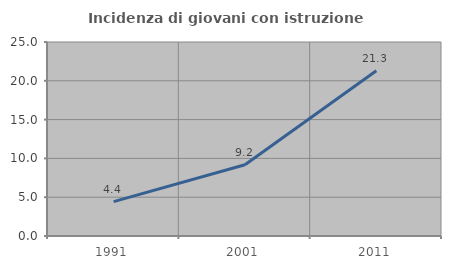
| Category | Incidenza di giovani con istruzione universitaria |
|---|---|
| 1991.0 | 4.435 |
| 2001.0 | 9.177 |
| 2011.0 | 21.3 |